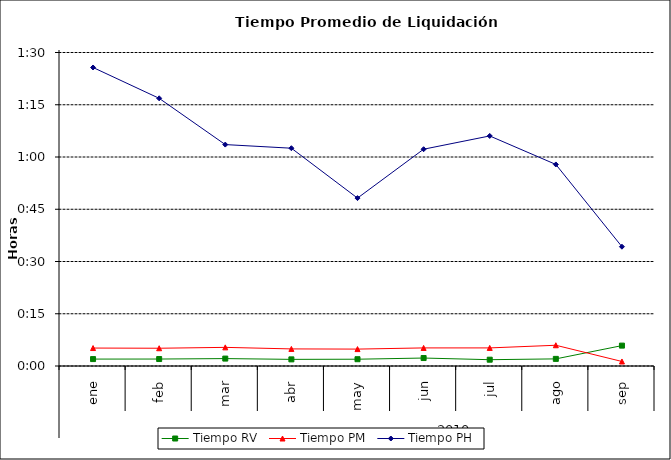
| Category | Tiempo RV | Tiempo PM | Tiempo PH |
|---|---|---|---|
| 0 | 0.001 | 0.004 | 0.06 |
| 1 | 0.001 | 0.004 | 0.053 |
| 2 | 0.001 | 0.004 | 0.044 |
| 3 | 0.001 | 0.003 | 0.043 |
| 4 | 0.001 | 0.003 | 0.033 |
| 5 | 0.002 | 0.004 | 0.043 |
| 6 | 0.001 | 0.004 | 0.046 |
| 7 | 0.001 | 0.004 | 0.04 |
| 8 | 0.004 | 0.001 | 0.024 |